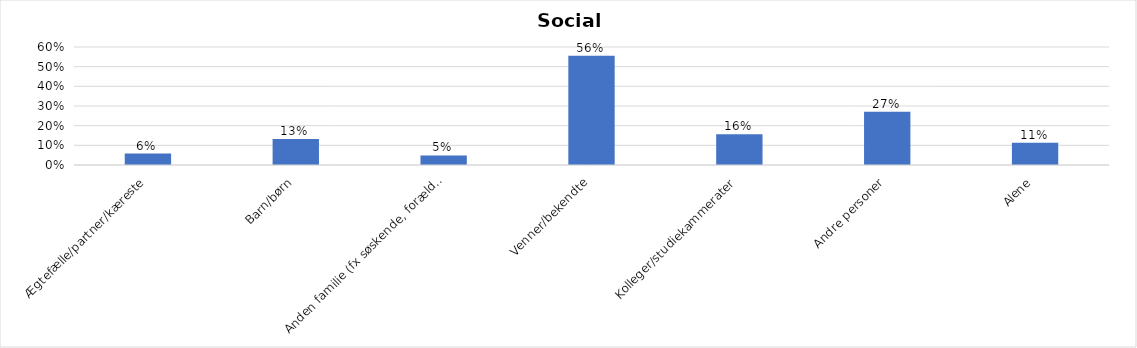
| Category | % |
|---|---|
| Ægtefælle/partner/kæreste | 0.058 |
| Barn/børn | 0.132 |
| Anden familie (fx søskende, forældre) | 0.049 |
| Venner/bekendte | 0.555 |
| Kolleger/studiekammerater | 0.157 |
| Andre personer | 0.27 |
| Alene | 0.113 |